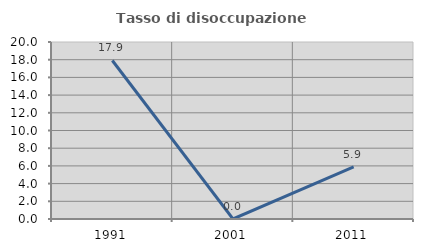
| Category | Tasso di disoccupazione giovanile  |
|---|---|
| 1991.0 | 17.91 |
| 2001.0 | 0 |
| 2011.0 | 5.882 |